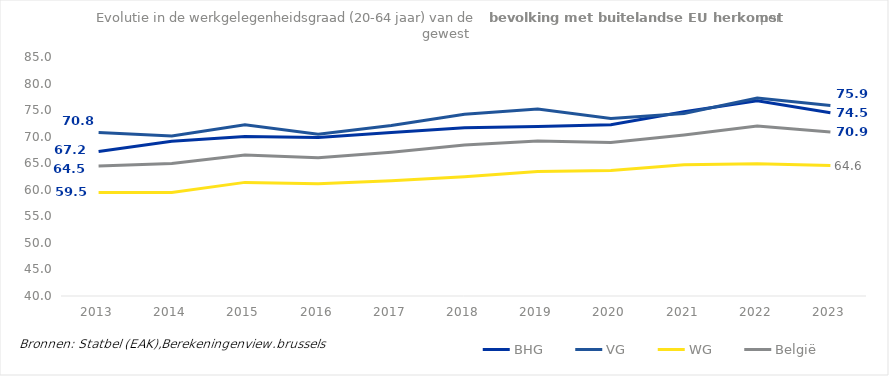
| Category | BHG | VG | WG | België |
|---|---|---|---|---|
| 2013.0 | 67.227 | 70.799 | 59.492 | 64.461 |
| 2014.0 | 69.12 | 70.148 | 59.481 | 64.936 |
| 2015.0 | 70.012 | 72.238 | 61.392 | 66.525 |
| 2016.0 | 69.838 | 70.466 | 61.146 | 66.049 |
| 2017.0 | 70.776 | 72.112 | 61.702 | 67.084 |
| 2018.0 | 71.687 | 74.202 | 62.435 | 68.42 |
| 2019.0 | 71.927 | 75.193 | 63.426 | 69.194 |
| 2020.0 | 72.25 | 73.428 | 63.624 | 68.902 |
| 2021.0 | 74.693 | 74.364 | 64.69 | 70.335 |
| 2022.0 | 76.753 | 77.286 | 64.887 | 72.016 |
| 2023.0 | 74.489 | 75.863 | 64.551 | 70.888 |